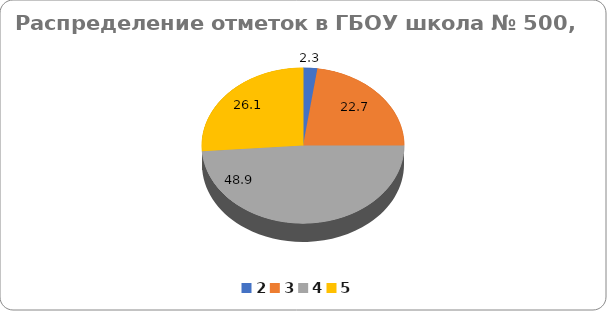
| Category | Series 0 |
|---|---|
| 2.0 | 2.27 |
| 3.0 | 22.73 |
| 4.0 | 48.86 |
| 5.0 | 26.14 |